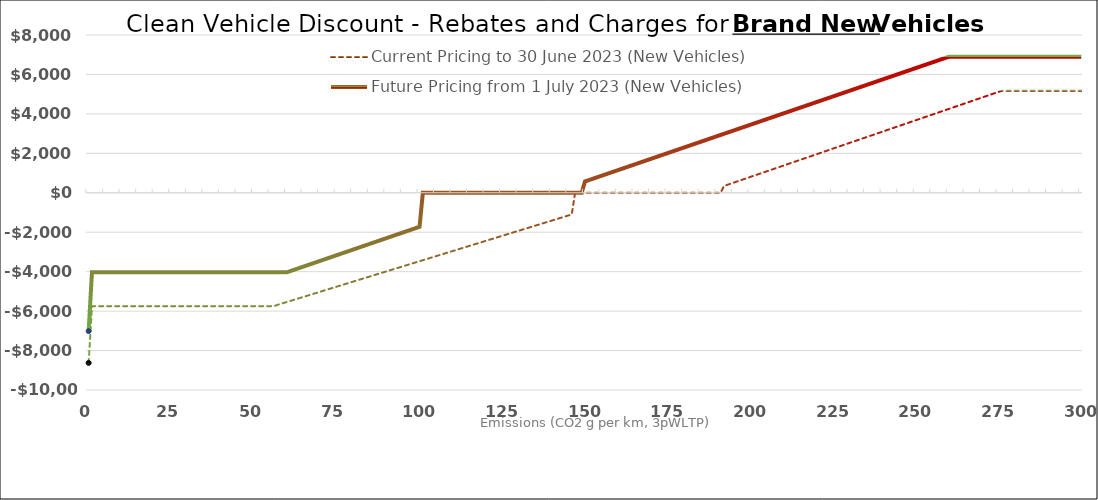
| Category |  Current Pricing to 30 June 2023 (New Vehicles)  |  Future Pricing from 1 July 2023 (New Vehicles)  |
|---|---|---|
| 0.0 | -8625 | -7015 |
| 1.0 | -5750 | -4025 |
| 2.0 | -5750 | -4025 |
| 3.0 | -5750 | -4025 |
| 4.0 | -5750 | -4025 |
| 5.0 | -5750 | -4025 |
| 6.0 | -5750 | -4025 |
| 7.0 | -5750 | -4025 |
| 8.0 | -5750 | -4025 |
| 9.0 | -5750 | -4025 |
| 10.0 | -5750 | -4025 |
| 11.0 | -5750 | -4025 |
| 12.0 | -5750 | -4025 |
| 13.0 | -5750 | -4025 |
| 14.0 | -5750 | -4025 |
| 15.0 | -5750 | -4025 |
| 16.0 | -5750 | -4025 |
| 17.0 | -5750 | -4025 |
| 18.0 | -5750 | -4025 |
| 19.0 | -5750 | -4025 |
| 20.0 | -5750 | -4025 |
| 21.0 | -5750 | -4025 |
| 22.0 | -5750 | -4025 |
| 23.0 | -5750 | -4025 |
| 24.0 | -5750 | -4025 |
| 25.0 | -5750 | -4025 |
| 26.0 | -5750 | -4025 |
| 27.0 | -5750 | -4025 |
| 28.0 | -5750 | -4025 |
| 29.0 | -5750 | -4025 |
| 30.0 | -5750 | -4025 |
| 31.0 | -5750 | -4025 |
| 32.0 | -5750 | -4025 |
| 33.0 | -5750 | -4025 |
| 34.0 | -5750 | -4025 |
| 35.0 | -5750 | -4025 |
| 36.0 | -5750 | -4025 |
| 37.0 | -5750 | -4025 |
| 38.0 | -5750 | -4025 |
| 39.0 | -5750 | -4025 |
| 40.0 | -5750 | -4025 |
| 41.0 | -5750 | -4025 |
| 42.0 | -5750 | -4025 |
| 43.0 | -5750 | -4025 |
| 44.0 | -5750 | -4025 |
| 45.0 | -5750 | -4025 |
| 46.0 | -5750 | -4025 |
| 47.0 | -5750 | -4025 |
| 48.0 | -5750 | -4025 |
| 49.0 | -5750 | -4025 |
| 50.0 | -5750 | -4025 |
| 51.0 | -5750 | -4025 |
| 52.0 | -5750 | -4025 |
| 53.0 | -5750 | -4025 |
| 54.0 | -5750 | -4025 |
| 55.0 | -5750 | -4025 |
| 56.0 | -5750 | -4025 |
| 57.0 | -5686.552 | -4025 |
| 58.0 | -5635 | -4025 |
| 59.0 | -5583.448 | -4025 |
| 60.0 | -5531.897 | -4025 |
| 61.0 | -5480.345 | -3967.5 |
| 62.0 | -5428.793 | -3910 |
| 63.0 | -5377.241 | -3852.5 |
| 64.0 | -5325.69 | -3795 |
| 65.0 | -5274.138 | -3737.5 |
| 66.0 | -5222.586 | -3680 |
| 67.0 | -5171.034 | -3622.5 |
| 68.0 | -5119.483 | -3565 |
| 69.0 | -5067.931 | -3507.5 |
| 70.0 | -5016.379 | -3450 |
| 71.0 | -4964.828 | -3392.5 |
| 72.0 | -4913.276 | -3335 |
| 73.0 | -4861.724 | -3277.5 |
| 74.0 | -4810.172 | -3220 |
| 75.0 | -4758.621 | -3162.5 |
| 76.0 | -4707.069 | -3105 |
| 77.0 | -4655.517 | -3047.5 |
| 78.0 | -4603.966 | -2990 |
| 79.0 | -4552.414 | -2932.5 |
| 80.0 | -4500.862 | -2875 |
| 81.0 | -4449.31 | -2817.5 |
| 82.0 | -4397.759 | -2760 |
| 83.0 | -4346.207 | -2702.5 |
| 84.0 | -4294.655 | -2645 |
| 85.0 | -4243.103 | -2587.5 |
| 86.0 | -4191.552 | -2530 |
| 87.0 | -4140 | -2472.5 |
| 88.0 | -4088.448 | -2415 |
| 89.0 | -4036.897 | -2357.5 |
| 90.0 | -3985.345 | -2300 |
| 91.0 | -3933.793 | -2242.5 |
| 92.0 | -3882.241 | -2185 |
| 93.0 | -3830.69 | -2127.5 |
| 94.0 | -3779.138 | -2070 |
| 95.0 | -3727.586 | -2012.5 |
| 96.0 | -3676.034 | -1955 |
| 97.0 | -3624.483 | -1897.5 |
| 98.0 | -3572.931 | -1840 |
| 99.0 | -3521.379 | -1782.5 |
| 100.0 | -3469.828 | -1725 |
| 101.0 | -3418.276 | 0 |
| 102.0 | -3366.724 | 0 |
| 103.0 | -3315.172 | 0 |
| 104.0 | -3263.621 | 0 |
| 105.0 | -3212.069 | 0 |
| 106.0 | -3160.517 | 0 |
| 107.0 | -3108.966 | 0 |
| 108.0 | -3057.414 | 0 |
| 109.0 | -3005.862 | 0 |
| 110.0 | -2954.31 | 0 |
| 111.0 | -2902.759 | 0 |
| 112.0 | -2851.207 | 0 |
| 113.0 | -2799.655 | 0 |
| 114.0 | -2748.103 | 0 |
| 115.0 | -2696.552 | 0 |
| 116.0 | -2645 | 0 |
| 117.0 | -2593.448 | 0 |
| 118.0 | -2541.897 | 0 |
| 119.0 | -2490.345 | 0 |
| 120.0 | -2438.793 | 0 |
| 121.0 | -2387.241 | 0 |
| 122.0 | -2335.69 | 0 |
| 123.0 | -2284.138 | 0 |
| 124.0 | -2232.586 | 0 |
| 125.0 | -2181.034 | 0 |
| 126.0 | -2129.483 | 0 |
| 127.0 | -2077.931 | 0 |
| 128.0 | -2026.379 | 0 |
| 129.0 | -1974.828 | 0 |
| 130.0 | -1923.276 | 0 |
| 131.0 | -1871.724 | 0 |
| 132.0 | -1820.172 | 0 |
| 133.0 | -1768.621 | 0 |
| 134.0 | -1717.069 | 0 |
| 135.0 | -1665.517 | 0 |
| 136.0 | -1613.966 | 0 |
| 137.0 | -1562.414 | 0 |
| 138.0 | -1510.862 | 0 |
| 139.0 | -1459.31 | 0 |
| 140.0 | -1407.759 | 0 |
| 141.0 | -1356.207 | 0 |
| 142.0 | -1304.655 | 0 |
| 143.0 | -1253.103 | 0 |
| 144.0 | -1201.552 | 0 |
| 145.0 | -1150 | 0 |
| 146.0 | -1098.448 | 0 |
| 147.0 | 0 | 0 |
| 148.0 | 0 | 0 |
| 149.0 | 0 | 0 |
| 150.0 | 0 | 575 |
| 151.0 | 0 | 632.5 |
| 152.0 | 0 | 690 |
| 153.0 | 0 | 747.5 |
| 154.0 | 0 | 805 |
| 155.0 | 0 | 862.5 |
| 156.0 | 0 | 920 |
| 157.0 | 0 | 977.5 |
| 158.0 | 0 | 1035 |
| 159.0 | 0 | 1092.5 |
| 160.0 | 0 | 1150 |
| 161.0 | 0 | 1207.5 |
| 162.0 | 0 | 1265 |
| 163.0 | 0 | 1322.5 |
| 164.0 | 0 | 1380 |
| 165.0 | 0 | 1437.5 |
| 166.0 | 0 | 1495 |
| 167.0 | 0 | 1552.5 |
| 168.0 | 0 | 1610 |
| 169.0 | 0 | 1667.5 |
| 170.0 | 0 | 1725 |
| 171.0 | 0 | 1782.5 |
| 172.0 | 0 | 1840 |
| 173.0 | 0 | 1897.5 |
| 174.0 | 0 | 1955 |
| 175.0 | 0 | 2012.5 |
| 176.0 | 0 | 2070 |
| 177.0 | 0 | 2127.5 |
| 178.0 | 0 | 2185 |
| 179.0 | 0 | 2242.5 |
| 180.0 | 0 | 2300 |
| 181.0 | 0 | 2357.5 |
| 182.0 | 0 | 2415 |
| 183.0 | 0 | 2472.5 |
| 184.0 | 0 | 2530 |
| 185.0 | 0 | 2587.5 |
| 186.0 | 0 | 2645 |
| 187.0 | 0 | 2702.5 |
| 188.0 | 0 | 2760 |
| 189.0 | 0 | 2817.5 |
| 190.0 | 0 | 2875 |
| 191.0 | 0 | 2932.5 |
| 192.0 | 345 | 2990 |
| 193.0 | 402.5 | 3047.5 |
| 194.0 | 460 | 3105 |
| 195.0 | 517.5 | 3162.5 |
| 196.0 | 575 | 3220 |
| 197.0 | 632.5 | 3277.5 |
| 198.0 | 690 | 3335 |
| 199.0 | 747.5 | 3392.5 |
| 200.0 | 805 | 3450 |
| 201.0 | 862.5 | 3507.5 |
| 202.0 | 920 | 3565 |
| 203.0 | 977.5 | 3622.5 |
| 204.0 | 1035 | 3680 |
| 205.0 | 1092.5 | 3737.5 |
| 206.0 | 1150 | 3795 |
| 207.0 | 1207.5 | 3852.5 |
| 208.0 | 1265 | 3910 |
| 209.0 | 1322.5 | 3967.5 |
| 210.0 | 1380 | 4025 |
| 211.0 | 1437.5 | 4082.5 |
| 212.0 | 1495 | 4140 |
| 213.0 | 1552.5 | 4197.5 |
| 214.0 | 1610 | 4255 |
| 215.0 | 1667.5 | 4312.5 |
| 216.0 | 1725 | 4370 |
| 217.0 | 1782.5 | 4427.5 |
| 218.0 | 1840 | 4485 |
| 219.0 | 1897.5 | 4542.5 |
| 220.0 | 1955 | 4600 |
| 221.0 | 2012.5 | 4657.5 |
| 222.0 | 2070 | 4715 |
| 223.0 | 2127.5 | 4772.5 |
| 224.0 | 2185 | 4830 |
| 225.0 | 2242.5 | 4887.5 |
| 226.0 | 2300 | 4945 |
| 227.0 | 2357.5 | 5002.5 |
| 228.0 | 2415 | 5060 |
| 229.0 | 2472.5 | 5117.5 |
| 230.0 | 2530 | 5175 |
| 231.0 | 2587.5 | 5232.5 |
| 232.0 | 2645 | 5290 |
| 233.0 | 2702.5 | 5347.5 |
| 234.0 | 2760 | 5405 |
| 235.0 | 2817.5 | 5462.5 |
| 236.0 | 2875 | 5520 |
| 237.0 | 2932.5 | 5577.5 |
| 238.0 | 2990 | 5635 |
| 239.0 | 3047.5 | 5692.5 |
| 240.0 | 3105 | 5750 |
| 241.0 | 3162.5 | 5807.5 |
| 242.0 | 3220 | 5865 |
| 243.0 | 3277.5 | 5922.5 |
| 244.0 | 3335 | 5980 |
| 245.0 | 3392.5 | 6037.5 |
| 246.0 | 3450 | 6095 |
| 247.0 | 3507.5 | 6152.5 |
| 248.0 | 3565 | 6210 |
| 249.0 | 3622.5 | 6267.5 |
| 250.0 | 3680 | 6325 |
| 251.0 | 3737.5 | 6382.5 |
| 252.0 | 3795 | 6440 |
| 253.0 | 3852.5 | 6497.5 |
| 254.0 | 3910 | 6555 |
| 255.0 | 3967.5 | 6612.5 |
| 256.0 | 4025 | 6670 |
| 257.0 | 4082.5 | 6727.5 |
| 258.0 | 4140 | 6785 |
| 259.0 | 4197.5 | 6842.5 |
| 260.0 | 4255 | 6900 |
| 261.0 | 4312.5 | 6900 |
| 262.0 | 4370 | 6900 |
| 263.0 | 4427.5 | 6900 |
| 264.0 | 4485 | 6900 |
| 265.0 | 4542.5 | 6900 |
| 266.0 | 4600 | 6900 |
| 267.0 | 4657.5 | 6900 |
| 268.0 | 4715 | 6900 |
| 269.0 | 4772.5 | 6900 |
| 270.0 | 4830 | 6900 |
| 271.0 | 4887.5 | 6900 |
| 272.0 | 4945 | 6900 |
| 273.0 | 5002.5 | 6900 |
| 274.0 | 5060 | 6900 |
| 275.0 | 5117.5 | 6900 |
| 276.0 | 5175 | 6900 |
| 277.0 | 5175 | 6900 |
| 278.0 | 5175 | 6900 |
| 279.0 | 5175 | 6900 |
| 280.0 | 5175 | 6900 |
| 281.0 | 5175 | 6900 |
| 282.0 | 5175 | 6900 |
| 283.0 | 5175 | 6900 |
| 284.0 | 5175 | 6900 |
| 285.0 | 5175 | 6900 |
| 286.0 | 5175 | 6900 |
| 287.0 | 5175 | 6900 |
| 288.0 | 5175 | 6900 |
| 289.0 | 5175 | 6900 |
| 290.0 | 5175 | 6900 |
| 291.0 | 5175 | 6900 |
| 292.0 | 5175 | 6900 |
| 293.0 | 5175 | 6900 |
| 294.0 | 5175 | 6900 |
| 295.0 | 5175 | 6900 |
| 296.0 | 5175 | 6900 |
| 297.0 | 5175 | 6900 |
| 298.0 | 5175 | 6900 |
| 299.0 | 5175 | 6900 |
| 300.0 | 5175 | 6900 |